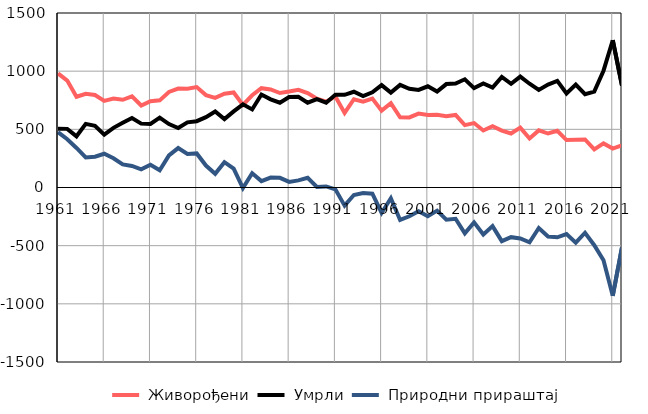
| Category |  Живорођени |  Умрли |  Природни прираштај |
|---|---|---|---|
| 1961.0 | 981 | 505 | 476 |
| 1962.0 | 919 | 504 | 415 |
| 1963.0 | 780 | 440 | 340 |
| 1964.0 | 806 | 547 | 259 |
| 1965.0 | 795 | 530 | 265 |
| 1966.0 | 744 | 454 | 290 |
| 1967.0 | 764 | 513 | 251 |
| 1968.0 | 754 | 556 | 198 |
| 1969.0 | 783 | 598 | 185 |
| 1970.0 | 705 | 549 | 156 |
| 1971.0 | 742 | 546 | 196 |
| 1972.0 | 749 | 601 | 148 |
| 1973.0 | 821 | 545 | 276 |
| 1974.0 | 850 | 511 | 339 |
| 1975.0 | 849 | 560 | 289 |
| 1976.0 | 863 | 570 | 293 |
| 1977.0 | 794 | 605 | 189 |
| 1978.0 | 771 | 653 | 118 |
| 1979.0 | 806 | 588 | 218 |
| 1980.0 | 817 | 654 | 163 |
| 1981.0 | 710 | 715 | -5 |
| 1982.0 | 793 | 671 | 122 |
| 1983.0 | 854 | 799 | 55 |
| 1984.0 | 843 | 758 | 85 |
| 1985.0 | 812 | 729 | 83 |
| 1986.0 | 825 | 777 | 48 |
| 1987.0 | 840 | 779 | 61 |
| 1988.0 | 812 | 729 | 83 |
| 1989.0 | 764 | 759 | 5 |
| 1990.0 | 738 | 729 | 9 |
| 1991.0 | 782 | 798 | -16 |
| 1992.0 | 641 | 797 | -156 |
| 1993.0 | 759 | 823 | -64 |
| 1994.0 | 738 | 785 | -47 |
| 1995.0 | 765 | 818 | -53 |
| 1996.0 | 661 | 880 | -219 |
| 1997.0 | 724 | 816 | -92 |
| 1998.0 | 603 | 882 | -279 |
| 1999.0 | 602 | 849 | -247 |
| 2000.0 | 635 | 839 | -204 |
| 2001.0 | 623 | 870 | -247 |
| 2002.0 | 626 | 825 | -199 |
| 2003.0 | 612 | 889 | -277 |
| 2004.0 | 624 | 893 | -269 |
| 2005.0 | 536 | 930 | -394 |
| 2006.0 | 554 | 854 | -300 |
| 2007.0 | 490 | 894 | -404 |
| 2008.0 | 527 | 859 | -332 |
| 2009.0 | 489 | 950 | -461 |
| 2010.0 | 464 | 891 | -427 |
| 2011.0 | 515 | 953 | -438 |
| 2012.0 | 421 | 892 | -471 |
| 2013.0 | 491 | 839 | -348 |
| 2014.0 | 464 | 885 | -421 |
| 2015.0 | 488 | 916 | -428 |
| 2016.0 | 408 | 808 | -400 |
| 2017.0 | 410 | 884 | -474 |
| 2018.0 | 413 | 802 | -389 |
| 2019.0 | 328 | 824 | -496 |
| 2020.0 | 379 | 1004 | -625 |
| 2021.0 | 335 | 1266 | -931 |
| 2022.0 | 362 | 877 | -515 |